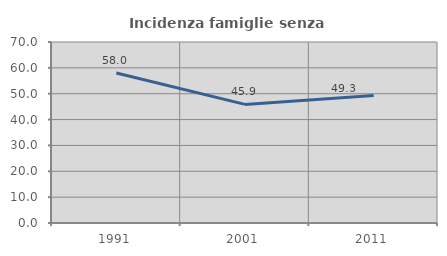
| Category | Incidenza famiglie senza nuclei |
|---|---|
| 1991.0 | 58 |
| 2001.0 | 45.872 |
| 2011.0 | 49.275 |